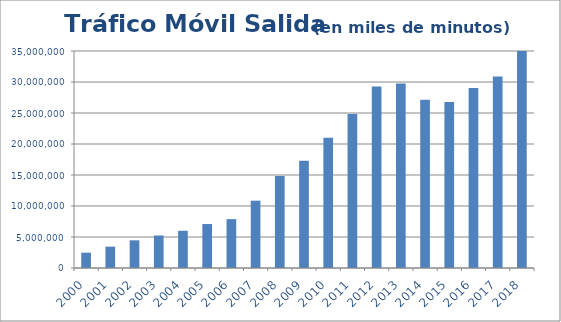
| Category | Tráfico Salida  en miles de minutos  |
|---|---|
| 2000 | 2471208.216 |
| 2001 | 3441736.145 |
| 2002 | 4464101.558 |
| 2003 | 5237945.688 |
| 2004 | 6003889.136 |
| 2005 | 7089121.671 |
| 2006 | 7881070.445 |
| 2007 | 10857829.097 |
| 2008 | 14842544.992 |
| 2009 | 17315937.37 |
| 2010 | 21012307.587 |
| 2011 | 24832335.384 |
| 2012 | 29284513.139 |
| 2013 | 29748487.795 |
| 2014 | 27120732.321 |
| 2015 | 26759882.276 |
| 2016 | 29023085.247 |
| 2017 | 30893589.798 |
| 2018 | 35010096.544 |